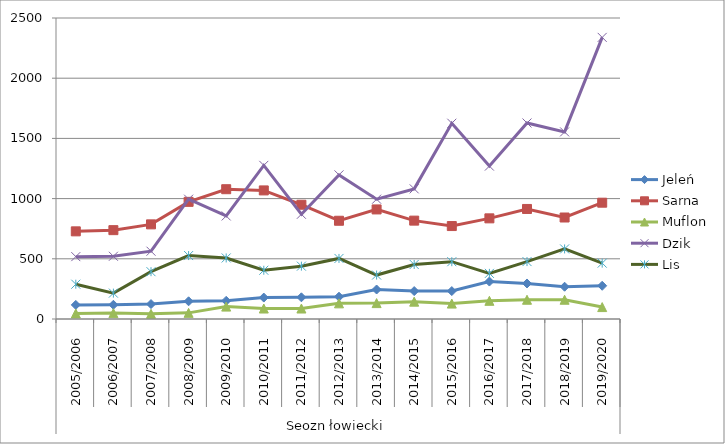
| Category | Jeleń | Sarna | Muflon | Dzik | Lis |
|---|---|---|---|---|---|
| 0 | 117 | 728 | 46 | 518 | 289 |
| 1 | 118 | 738 | 49 | 521 | 215 |
| 2 | 124 | 786 | 43 | 563 | 393 |
| 3 | 147 | 973 | 51 | 995 | 527 |
| 4 | 151 | 1078 | 103 | 856 | 507 |
| 5 | 178 | 1068 | 87 | 1276 | 405 |
| 6 | 180 | 949 | 87 | 870 | 439 |
| 7 | 185 | 816 | 130 | 1197 | 503 |
| 8 | 245 | 910 | 132 | 995 | 365 |
| 9 | 232 | 817 | 144 | 1081 | 453 |
| 10 | 232 | 772 | 128 | 1626 | 476 |
| 11 | 311 | 836 | 151 | 1270 | 379 |
| 12 | 295 | 914 | 160 | 1628 | 477 |
| 13 | 268 | 843 | 160 | 1554 | 582 |
| 14 | 276 | 966 | 99 | 2339 | 464 |